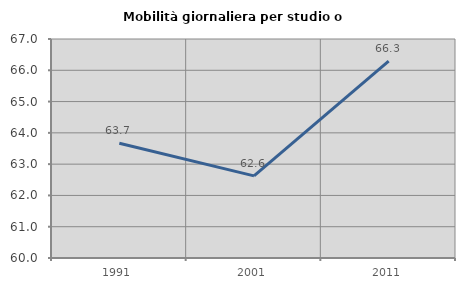
| Category | Mobilità giornaliera per studio o lavoro |
|---|---|
| 1991.0 | 63.668 |
| 2001.0 | 62.624 |
| 2011.0 | 66.292 |